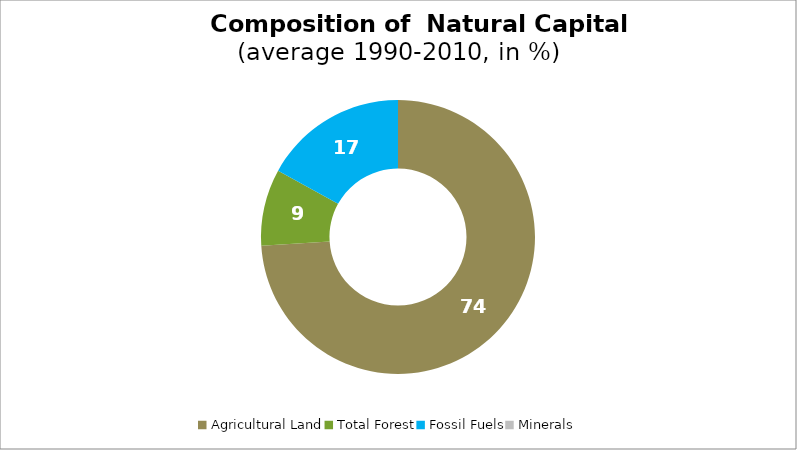
| Category | Series 0 |
|---|---|
| Agricultural Land | 73.969 |
| Total Forest | 9.072 |
| Fossil Fuels | 16.959 |
| Minerals | 0 |